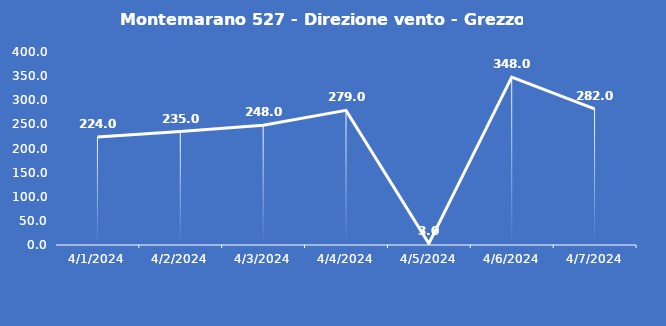
| Category | Montemarano 527 - Direzione vento - Grezzo (°N) |
|---|---|
| 4/1/24 | 224 |
| 4/2/24 | 235 |
| 4/3/24 | 248 |
| 4/4/24 | 279 |
| 4/5/24 | 3 |
| 4/6/24 | 348 |
| 4/7/24 | 282 |